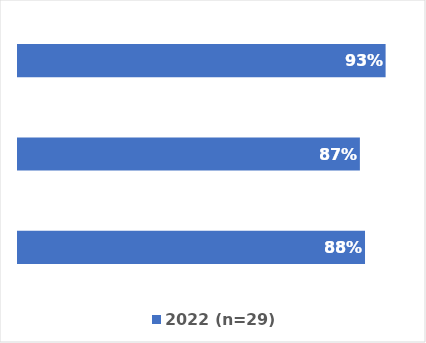
| Category | 2022 (n=29) |
|---|---|
| Listeria | 88.073 |
| STEC | 86.774 |
| Salmonella | 93.3 |